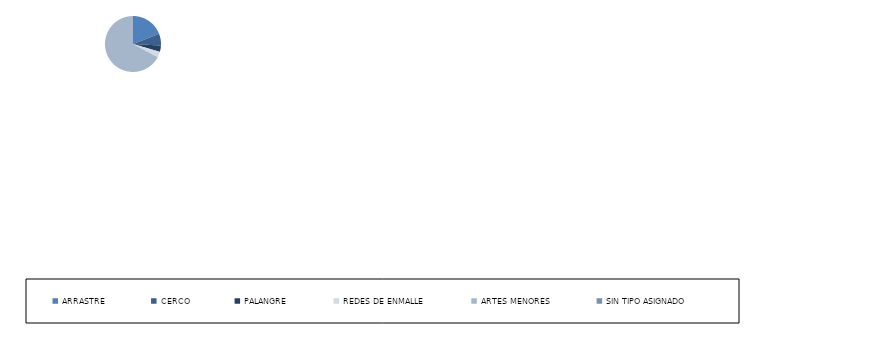
| Category | Series 0 |
|---|---|
| ARRASTRE | 179 |
| CERCO | 64 |
| PALANGRE | 34 |
| REDES DE ENMALLE | 31 |
| ARTES MENORES | 630 |
| SIN TIPO ASIGNADO | 0 |